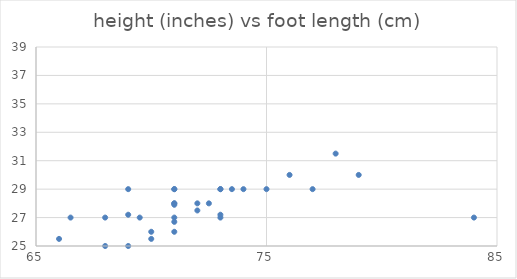
| Category | Series 0 |
|---|---|
| 66.5 | 27 |
| 73.5 | 29 |
| 70.0 | 25.5 |
| 71.0 | 27.9 |
| 73.0 | 27 |
| 71.0 | 26 |
| 71.0 | 29 |
| 69.5 | 27 |
| 73.0 | 29 |
| 71.0 | 27 |
| 69.0 | 29 |
| 69.0 | 27.2 |
| 73.0 | 29 |
| 75.0 | 29 |
| 73.0 | 27.2 |
| 72.0 | 27.5 |
| 69.0 | 25 |
| 68.0 | 25 |
| 72.5 | 28 |
| 78.0 | 31.5 |
| 79.0 | 30 |
| 71.0 | 28 |
| 74.0 | 29 |
| 66.0 | 25.5 |
| 71.0 | 26.7 |
| 71.0 | 29 |
| 71.0 | 28 |
| 84.0 | 27 |
| 77.0 | 29 |
| 72.0 | 28 |
| 70.0 | 26 |
| 76.0 | 30 |
| 68.0 | 27 |